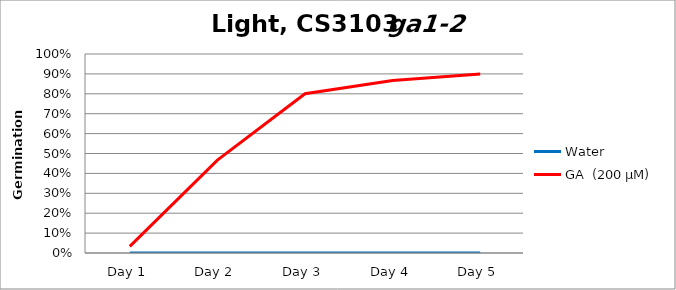
| Category | Water | GA  (200 µM)  |
|---|---|---|
| Day 1 | 0 | 0.033 |
| Day 2 | 0 | 0.467 |
| Day 3 | 0 | 0.8 |
| Day 4 | 0 | 0.867 |
| Day 5 | 0 | 0.9 |